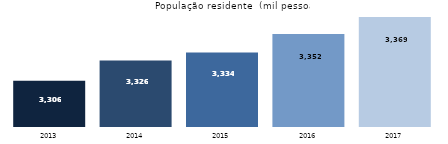
| Category | Series 1 |
|---|---|
| 2013.0 | 3305.8 |
| 2014.0 | 3326 |
| 2015.0 | 3334 |
| 2016.0 | 3352.194 |
| 2017.0 | 3369.183 |